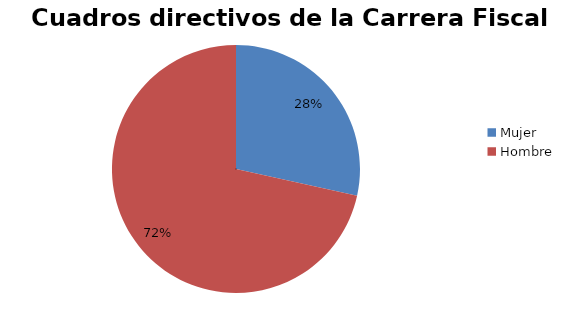
| Category | Series 0 |
|---|---|
| Mujer | 33 |
| Hombre | 83 |